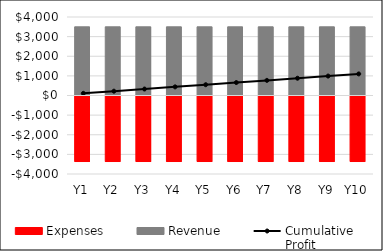
| Category | Expenses | Revenue |
|---|---|---|
| Y1 | -3390 | 3500 |
| Y2 | -3390 | 3500 |
| Y3 | -3390 | 3500 |
| Y4 | -3390 | 3500 |
| Y5 | -3390 | 3500 |
| Y6 | -3390 | 3500 |
| Y7 | -3390 | 3500 |
| Y8 | -3390 | 3500 |
| Y9 | -3390 | 3500 |
| Y10 | -3390 | 3500 |